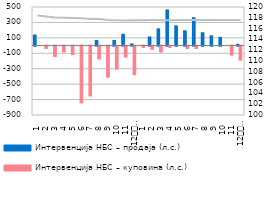
| Category | Интервенција НБС – продаја (л.с.) | Интервенција НБС – куповина (л.с.) |
|---|---|---|
| 1 | 130 | 0 |
| 2 | 0 | -30 |
| 3 | 0 | -135 |
| 4 | 0 | -75 |
| 5 | 0 | -110 |
| 6 | 0 | -735 |
| 7 | 0 | -645 |
| 8 | 60 | -165 |
| 9 | 0 | -400 |
| 10 | 60 | -295 |
| 11 | 140 | -140 |
| 12
2019. | 15 | -370 |
| 1 | 0 | -15 |
| 2 | 105 | -40 |
| 3 | 210 | -75 |
| 4 | 455 | -15 |
| 5 | 250 | 0 |
| 6 | 185 | -30 |
| 7 | 355 | -30 |
| 8 | 160 | 0 |
| 9 | 120 | 0 |
| 10 | 100 | 0 |
| 11 | 0 | -115 |
| 12
2020. | 10 | -180 |